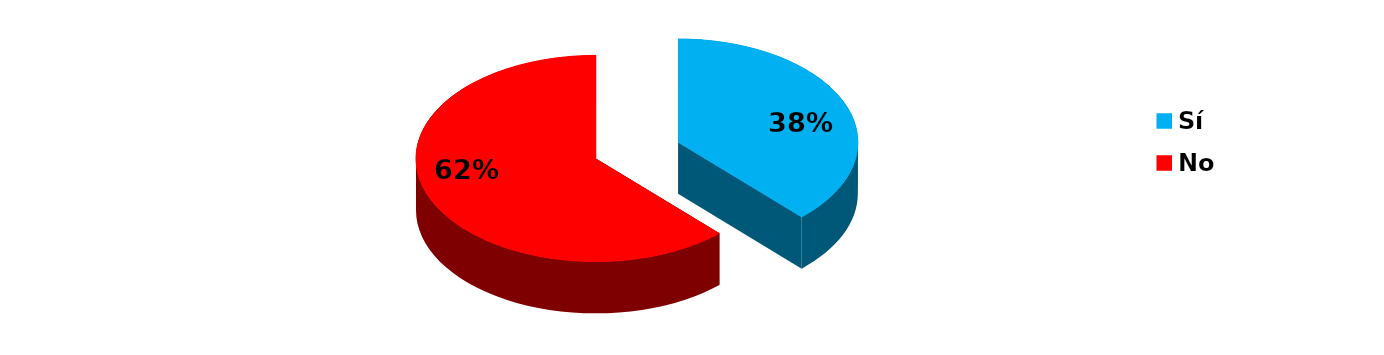
| Category | Series 0 |
|---|---|
| Sí | 11 |
| No | 18 |